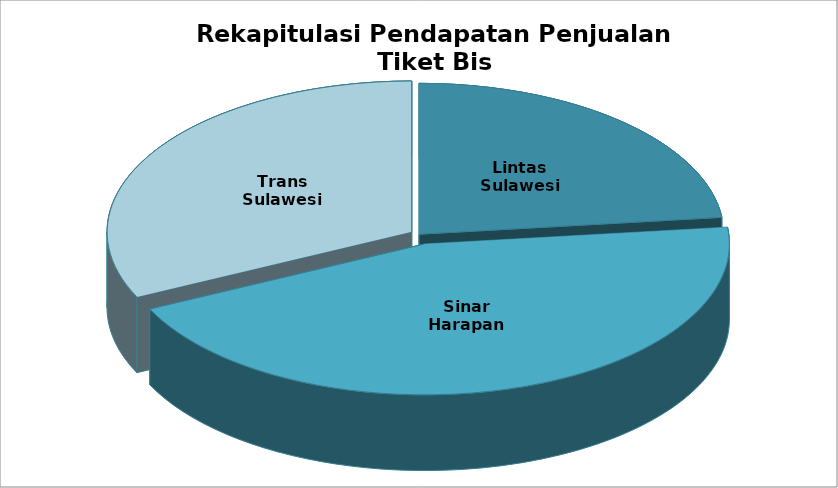
| Category | TOTAL PENDAPATAN |
|---|---|
| Lintas Sulawesi | 34900000 |
| Sinar Harapan | 67160000 |
| Trans Sulawesi | 48250000 |